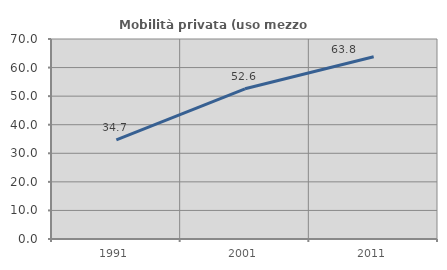
| Category | Mobilità privata (uso mezzo privato) |
|---|---|
| 1991.0 | 34.657 |
| 2001.0 | 52.574 |
| 2011.0 | 63.81 |